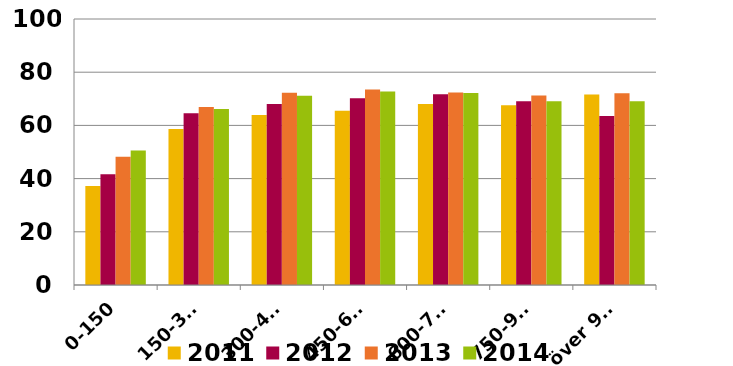
| Category | 2011 | 2012 | 2013 | 2014 |
|---|---|---|---|---|
| 0-150 | 37.221 | 41.604 | 48.202 | 50.54 |
| 150-300 | 58.627 | 64.573 | 66.895 | 66.196 |
| 300-450 | 63.886 | 68.083 | 72.284 | 71.124 |
| 450-600 | 65.489 | 70.168 | 73.473 | 72.72 |
| 600-750 | 68.06 | 71.69 | 72.35 | 72.172 |
| 750-900 | 67.587 | 69.081 | 71.241 | 69.105 |
| över 900 | 71.637 | 63.53 | 72.07 | 69.084 |